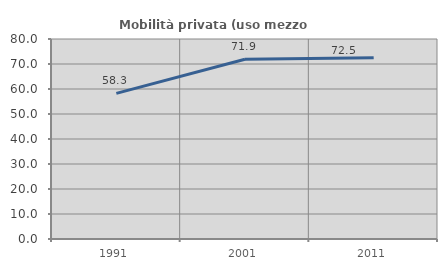
| Category | Mobilità privata (uso mezzo privato) |
|---|---|
| 1991.0 | 58.267 |
| 2001.0 | 71.871 |
| 2011.0 | 72.548 |